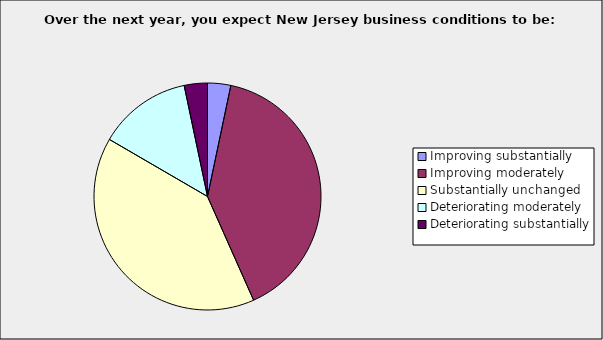
| Category | Series 0 |
|---|---|
| Improving substantially | 0.033 |
| Improving moderately | 0.4 |
| Substantially unchanged | 0.4 |
| Deteriorating moderately | 0.133 |
| Deteriorating substantially | 0.033 |